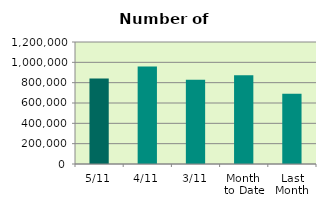
| Category | Series 0 |
|---|---|
| 5/11 | 840118 |
| 4/11 | 958070 |
| 3/11 | 827908 |
| Month 
to Date | 872187 |
| Last
Month | 689792.182 |